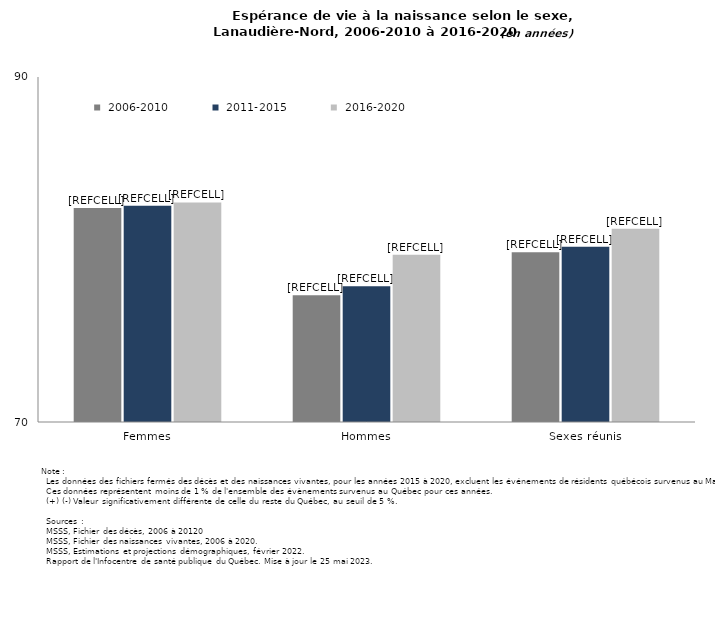
| Category |  2006-2010 |  2011-2015 |  2016-2020 |
|---|---|---|---|
| Femmes | 82.411 | 82.54 | 82.73 |
| Hommes | 77.345 | 77.864 | 79.689 |
| Sexes réunis | 79.837 | 80.157 | 81.201 |